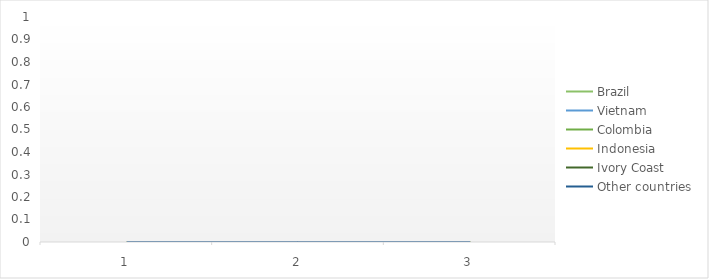
| Category | Brazil | Vietnam | Colombia | Indonesia | Ivory Coast | Other countries |
|---|---|---|---|---|---|---|
| 0 | 0 | 0 | 0 | 0 | 0 | 0 |
| 1 | 0 | 0 | 0 | 0 | 0 | 0 |
| 2 | 0 | 0 | 0 | 0 | 0 | 0 |